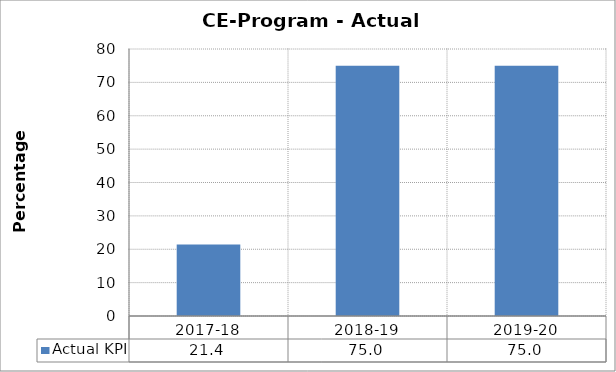
| Category | Actual KPI |
|---|---|
| 2017-18 | 21.429 |
| 2018-19 | 75 |
| 2019-20 | 75 |